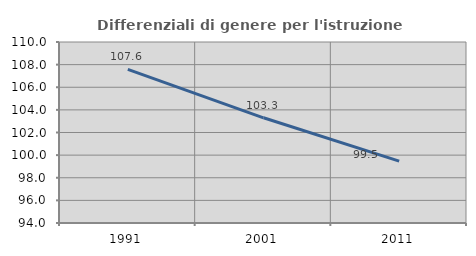
| Category | Differenziali di genere per l'istruzione superiore |
|---|---|
| 1991.0 | 107.585 |
| 2001.0 | 103.3 |
| 2011.0 | 99.471 |